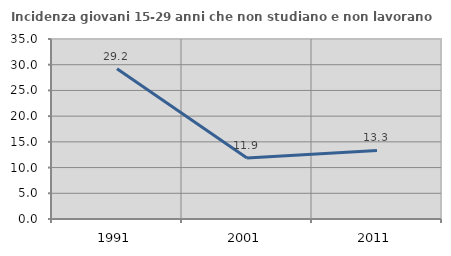
| Category | Incidenza giovani 15-29 anni che non studiano e non lavorano  |
|---|---|
| 1991.0 | 29.204 |
| 2001.0 | 11.864 |
| 2011.0 | 13.333 |